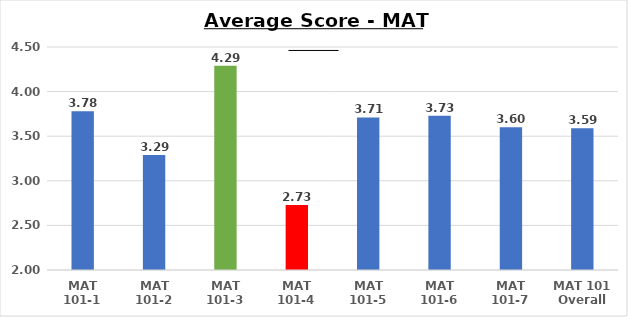
| Category | Average Score -MAT 101s |
|---|---|
| MAT 101-1 | 3.78 |
| MAT 101-2 | 3.29 |
| MAT 101-3 | 4.29 |
| MAT 101-4 | 2.73 |
| MAT 101-5 | 3.71 |
| MAT 101-6 | 3.73 |
| MAT 101-7 | 3.6 |
| MAT 101 Overall | 3.59 |